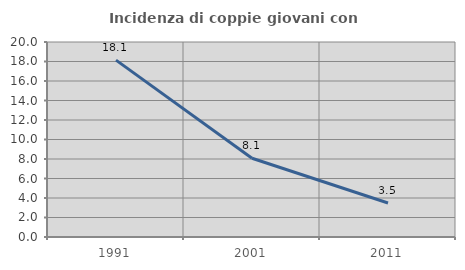
| Category | Incidenza di coppie giovani con figli |
|---|---|
| 1991.0 | 18.143 |
| 2001.0 | 8.077 |
| 2011.0 | 3.488 |